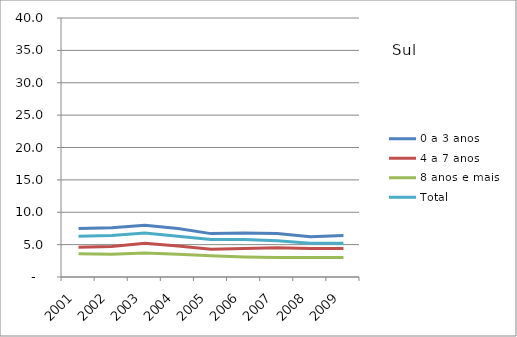
| Category | 0 a 3 anos | 4 a 7 anos | 8 anos e mais | Total |
|---|---|---|---|---|
| 2001.0 | 7.5 | 4.6 | 3.6 | 6.3 |
| 2002.0 | 7.6 | 4.7 | 3.5 | 6.4 |
| 2003.0 | 8 | 5.2 | 3.7 | 6.8 |
| 2004.0 | 7.5 | 4.8 | 3.5 | 6.3 |
| 2005.0 | 6.7 | 4.3 | 3.3 | 5.8 |
| 2006.0 | 6.8 | 4.4 | 3.1 | 5.8 |
| 2007.0 | 6.7 | 4.5 | 3 | 5.6 |
| 2008.0 | 6.2 | 4.4 | 3 | 5.2 |
| 2009.0 | 6.4 | 4.4 | 3 | 5.2 |